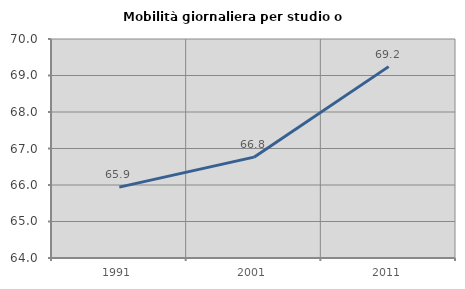
| Category | Mobilità giornaliera per studio o lavoro |
|---|---|
| 1991.0 | 65.942 |
| 2001.0 | 66.763 |
| 2011.0 | 69.243 |